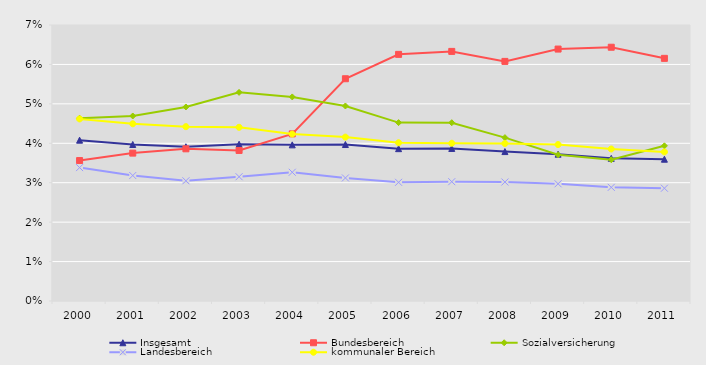
| Category | Insgesamt | Bundesbereich | Sozialversicherung | Landesbereich | kommunaler Bereich |
|---|---|---|---|---|---|
| 2000.0 | 0.041 | 0.036 | 0.046 | 0.034 | 0.046 |
| 2001.0 | 0.04 | 0.038 | 0.047 | 0.032 | 0.045 |
| 2002.0 | 0.039 | 0.039 | 0.049 | 0.03 | 0.044 |
| 2003.0 | 0.04 | 0.038 | 0.053 | 0.032 | 0.044 |
| 2004.0 | 0.04 | 0.042 | 0.052 | 0.033 | 0.042 |
| 2005.0 | 0.04 | 0.056 | 0.049 | 0.031 | 0.042 |
| 2006.0 | 0.039 | 0.063 | 0.045 | 0.03 | 0.04 |
| 2007.0 | 0.039 | 0.063 | 0.045 | 0.03 | 0.04 |
| 2008.0 | 0.038 | 0.061 | 0.041 | 0.03 | 0.04 |
| 2009.0 | 0.037 | 0.064 | 0.037 | 0.03 | 0.04 |
| 2010.0 | 0.036 | 0.064 | 0.036 | 0.029 | 0.039 |
| 2011.0 | 0.036 | 0.062 | 0.039 | 0.029 | 0.038 |